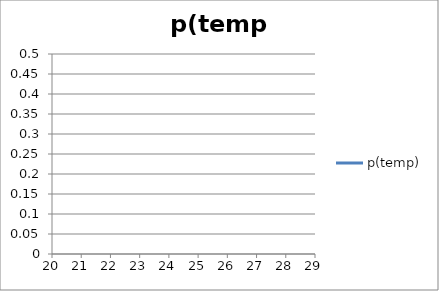
| Category | p(temp) |
|---|---|
| 21.0 | 1 |
| 22.0 | 1 |
| 23.0 | 1 |
| 24.0 | 1 |
| 25.0 | 1 |
| 26.0 | 1 |
| 27.0 | 1 |
| 28.0 | 1 |